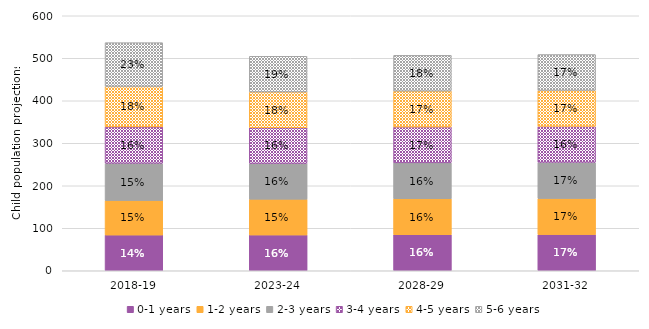
| Category | 0-1 years | 1-2 years | 2-3 years | 3-4 years | 4-5 years | 5-6 years |
|---|---|---|---|---|---|---|
| 2018-19 | 84.117 | 81.349 | 87.407 | 85.676 | 95.196 | 102.984 |
| 2023-24 | 84.23 | 84.129 | 84.083 | 84.06 | 84.075 | 84.117 |
| 2028-29 | 84.731 | 84.627 | 84.531 | 84.435 | 84.335 | 84.23 |
| 2031-32 | 85.089 | 84.971 | 84.845 | 84.731 | 84.627 | 84.531 |